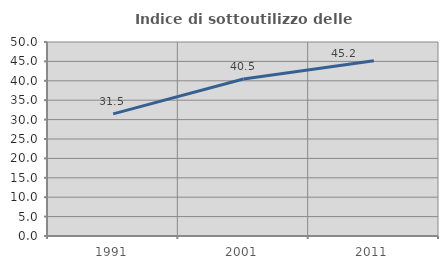
| Category | Indice di sottoutilizzo delle abitazioni  |
|---|---|
| 1991.0 | 31.481 |
| 2001.0 | 40.476 |
| 2011.0 | 45.161 |